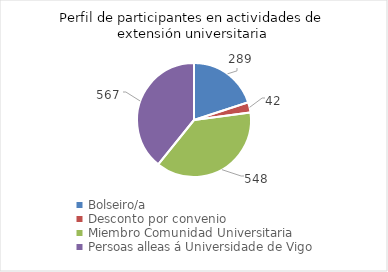
| Category | Series 0 |
|---|---|
| Bolseiro/a                | 289 |
| Desconto por convenio     | 42 |
| Miembro Comunidad Universitaria | 548 |
| Persoas alleas á Universidade de Vigo | 567 |